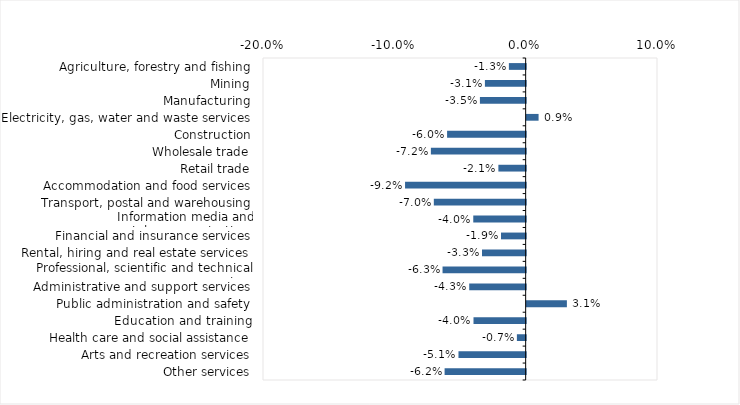
| Category | This week |
|---|---|
| Agriculture, forestry and fishing | -0.013 |
| Mining | -0.031 |
| Manufacturing | -0.035 |
| Electricity, gas, water and waste services | 0.009 |
| Construction | -0.06 |
| Wholesale trade | -0.072 |
| Retail trade | -0.021 |
| Accommodation and food services | -0.092 |
| Transport, postal and warehousing | -0.07 |
| Information media and telecommunications | -0.04 |
| Financial and insurance services | -0.019 |
| Rental, hiring and real estate services | -0.033 |
| Professional, scientific and technical services | -0.063 |
| Administrative and support services | -0.043 |
| Public administration and safety | 0.031 |
| Education and training | -0.04 |
| Health care and social assistance | -0.007 |
| Arts and recreation services | -0.051 |
| Other services | -0.062 |